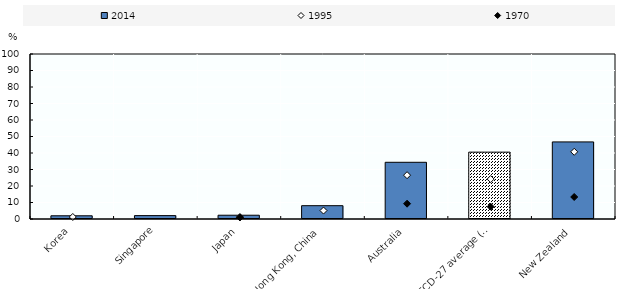
| Category | 2014 |
|---|---|
| Korea | 1.946 |
| Singapore | 2.046 |
| Japan | 2.29 |
| Hong Kong, China | 8.07 |
| Australia | 34.368 |
| OECD-27 average (d) | 40.512 |
| New Zealand | 46.717 |